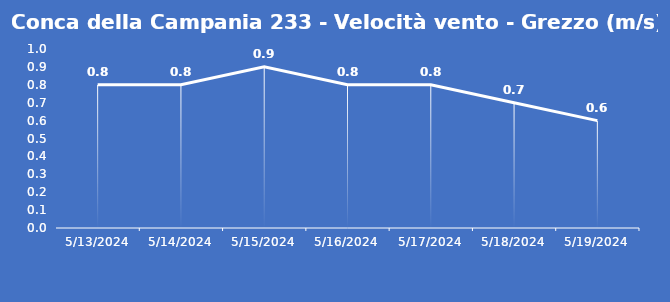
| Category | Conca della Campania 233 - Velocità vento - Grezzo (m/s) |
|---|---|
| 5/13/24 | 0.8 |
| 5/14/24 | 0.8 |
| 5/15/24 | 0.9 |
| 5/16/24 | 0.8 |
| 5/17/24 | 0.8 |
| 5/18/24 | 0.7 |
| 5/19/24 | 0.6 |